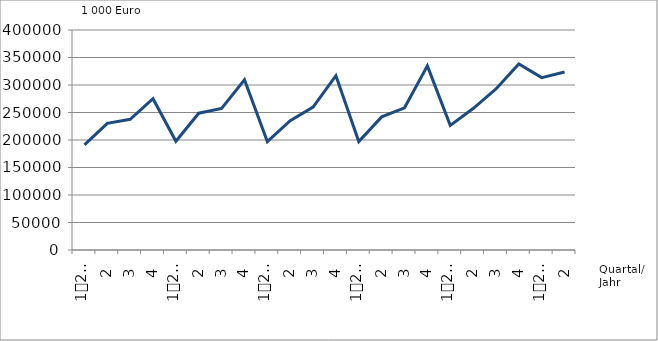
| Category | Ausbaugewerblicher Umsatz3 |
|---|---|
| 0 | 191088.978 |
| 1 | 230353.875 |
| 2 | 237735.574 |
| 3 | 275098.219 |
| 4 | 197732.754 |
| 5 | 248690.349 |
| 6 | 257339.084 |
| 7 | 309632.186 |
| 8 | 197030.42 |
| 9 | 235094.994 |
| 10 | 259758.438 |
| 11 | 316833.232 |
| 12 | 197219.532 |
| 13 | 242069.899 |
| 14 | 258547.84 |
| 15 | 334764.305 |
| 16 | 226552.317 |
| 17 | 257191.13 |
| 18 | 292853.372 |
| 19 | 338154.691 |
| 20 | 313433.569 |
| 21 | 323547.694 |